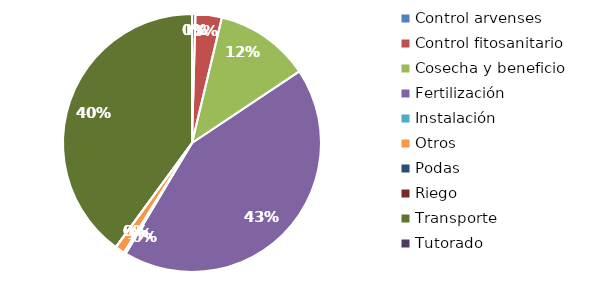
| Category | Valor |
|---|---|
| Control arvenses | 120000 |
| Control fitosanitario | 920000 |
| Cosecha y beneficio | 3328000 |
| Fertilización | 12000000 |
| Instalación | 70000 |
| Otros | 336000 |
| Podas | 0 |
| Riego | 0 |
| Transporte | 11162000 |
| Tutorado | 0 |